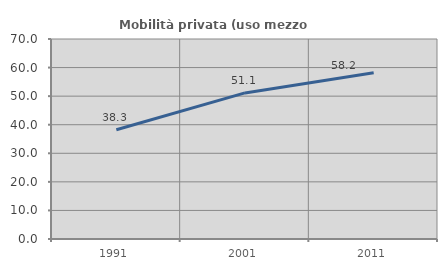
| Category | Mobilità privata (uso mezzo privato) |
|---|---|
| 1991.0 | 38.258 |
| 2001.0 | 51.128 |
| 2011.0 | 58.158 |